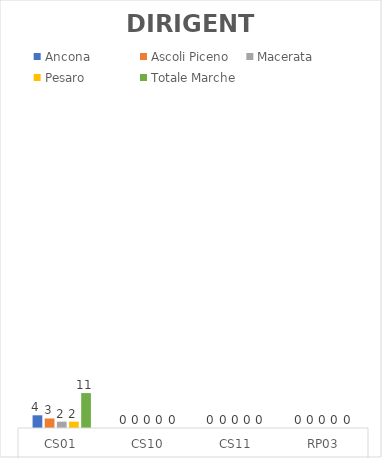
| Category | Ancona | Ascoli Piceno | Macerata | Pesaro | Totale Marche |
|---|---|---|---|---|---|
| 0 | 4 | 3 | 2 | 2 | 11 |
| 1 | 0 | 0 | 0 | 0 | 0 |
| 2 | 0 | 0 | 0 | 0 | 0 |
| 3 | 0 | 0 | 0 | 0 | 0 |